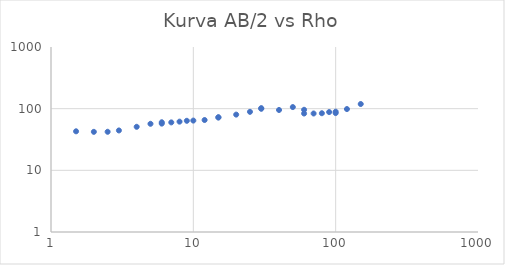
| Category | Series 0 |
|---|---|
| 1.5 | 42.936 |
| 2.0 | 42.079 |
| 2.5 | 42.19 |
| 3.0 | 44.33 |
| 4.0 | 50.787 |
| 5.0 | 56.826 |
| 6.0 | 60.214 |
| 6.0 | 57.2 |
| 7.0 | 59.884 |
| 8.0 | 61.598 |
| 9.0 | 63.572 |
| 10.0 | 64.095 |
| 12.0 | 65.458 |
| 15.0 | 71.773 |
| 15.0 | 72.603 |
| 20.0 | 80.086 |
| 25.0 | 88.873 |
| 30.0 | 99.578 |
| 30.0 | 101.951 |
| 40.0 | 95.203 |
| 50.0 | 106.127 |
| 60.0 | 95.92 |
| 60.0 | 83.45 |
| 70.0 | 83.513 |
| 80.0 | 84.339 |
| 90.0 | 88.088 |
| 100.0 | 89.459 |
| 100.0 | 84.8 |
| 120.0 | 98.575 |
| 150.0 | 118.913 |